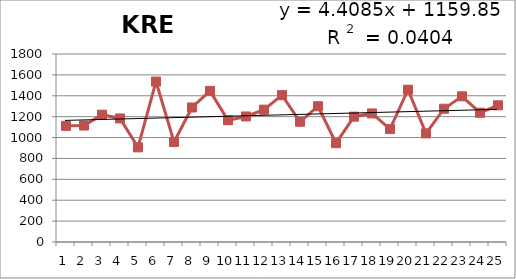
| Category | 1988-2012 |
|---|---|
| 0 | 1112 |
| 1 | 1115 |
| 2 | 1219 |
| 3 | 1183 |
| 4 | 906 |
| 5 | 1536 |
| 6 | 957 |
| 7 | 1288 |
| 8 | 1447 |
| 9 | 1166 |
| 10 | 1202 |
| 11 | 1267 |
| 12 | 1406 |
| 13 | 1151 |
| 14 | 1300 |
| 15 | 946 |
| 16 | 1200 |
| 17 | 1231 |
| 18 | 1081 |
| 19 | 1458 |
| 20 | 1040 |
| 21 | 1276 |
| 22 | 1395 |
| 23 | 1238 |
| 24 | 1309 |